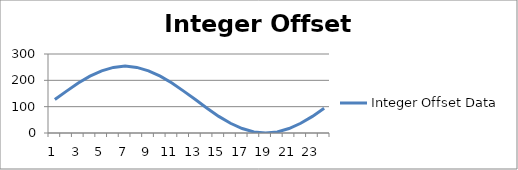
| Category | Integer Offset Data |
|---|---|
| 0 | 127 |
| 1 | 159 |
| 2 | 190 |
| 3 | 216 |
| 4 | 236 |
| 5 | 249 |
| 6 | 254 |
| 7 | 249 |
| 8 | 236 |
| 9 | 216 |
| 10 | 190 |
| 11 | 159 |
| 12 | 127 |
| 13 | 94 |
| 14 | 63 |
| 15 | 37 |
| 16 | 17 |
| 17 | 4 |
| 18 | 0 |
| 19 | 4 |
| 20 | 17 |
| 21 | 37 |
| 22 | 63 |
| 23 | 94 |